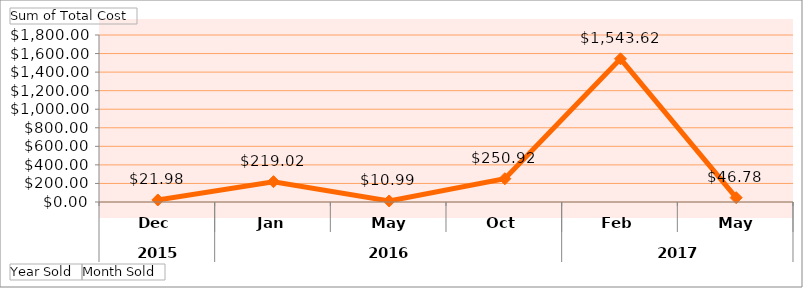
| Category | Total |
|---|---|
| 0 | 21.98 |
| 1 | 219.02 |
| 2 | 10.99 |
| 3 | 250.92 |
| 4 | 1543.62 |
| 5 | 46.78 |